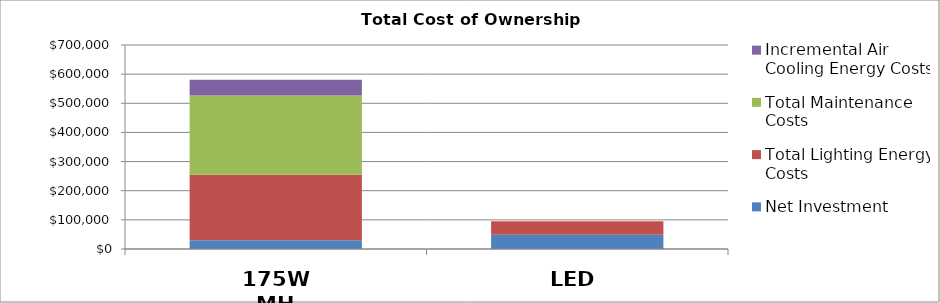
| Category | Net Investment | Total Lighting Energy Costs | Total Maintenance Costs | Incremental Air Cooling Energy Costs |
|---|---|---|---|---|
| 175W MH | 30000 | 224640 | 272000 | 54545.362 |
| LED | 49250 | 46170 | 0 | 0 |